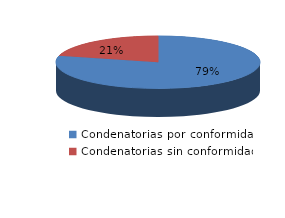
| Category | Series 0 |
|---|---|
| 0 | 45 |
| 1 | 12 |